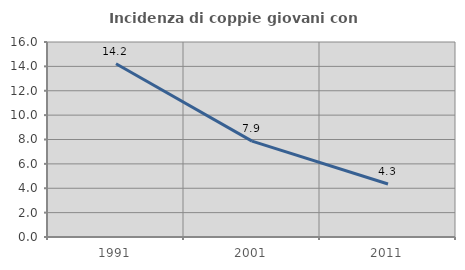
| Category | Incidenza di coppie giovani con figli |
|---|---|
| 1991.0 | 14.218 |
| 2001.0 | 7.87 |
| 2011.0 | 4.348 |